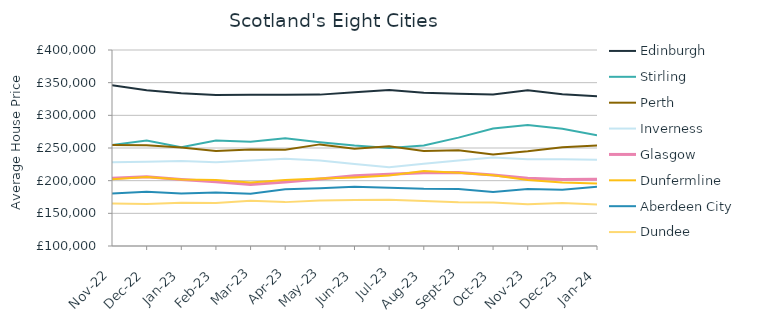
| Category | Edinburgh | Stirling | Perth | Inverness | Glasgow | Dunfermline | Aberdeen City | Dundee |
|---|---|---|---|---|---|---|---|---|
| 2022-11-01 | 345919.623 | 254687.702 | 254609.996 | 228196.917 | 203535.898 | 202133.11 | 180248.649 | 164940.668 |
| 2022-12-01 | 338258.433 | 261391.026 | 254214.036 | 228869.789 | 206013.942 | 205458.869 | 182983.696 | 164458.909 |
| 2023-01-01 | 333897.194 | 250993.349 | 250820.046 | 229967.946 | 201937.692 | 201715.667 | 180540.105 | 166327.162 |
| 2023-02-01 | 331257.609 | 261481.241 | 245592.641 | 228291.135 | 198434.858 | 200849.463 | 181709.541 | 165969.479 |
| 2023-03-01 | 331582.481 | 259387.977 | 247824.31 | 230905.22 | 194044.385 | 197090.451 | 179949.095 | 169329.842 |
| 2023-04-01 | 331545.847 | 264762.163 | 247150.137 | 233644.079 | 197764.586 | 201172.475 | 186755.325 | 167157.348 |
| 2023-05-01 | 331696.783 | 258878.61 | 255530.868 | 231001.628 | 202439.546 | 203133.925 | 188369.199 | 169737.786 |
| 2023-06-01 | 335156.447 | 253863.446 | 248732.407 | 225329.53 | 207516.216 | 204912.864 | 190717.778 | 170338.906 |
| 2023-07-01 | 338609.742 | 250098.695 | 252822.118 | 220557.185 | 209846.377 | 207848.125 | 189162.304 | 170766.453 |
| 2023-08-01 | 334475.477 | 253793.636 | 245454.47 | 225811.691 | 212000.684 | 214788.514 | 187557.356 | 168860.529 |
| 2023-09-01 | 332938.396 | 265870.971 | 246717.462 | 230704.766 | 212629.766 | 212172.771 | 187379.444 | 167099.192 |
| 2023-10-01 | 331725.321 | 279892.926 | 240238.055 | 235282.705 | 208533.916 | 208324.687 | 182592.083 | 166705.178 |
| 2023-11-01 | 338329.077 | 285289.024 | 244935.791 | 232813.264 | 203571.407 | 201172.536 | 187389.631 | 163938.203 |
| 2023-12-01 | 332193.556 | 279304.787 | 251248.953 | 232861.713 | 201943.285 | 197138.046 | 186226.104 | 165984.111 |
| 2024-01-01 | 329231.517 | 269508.419 | 253997.484 | 231970.065 | 202284.623 | 195634.425 | 190867.342 | 163548.08 |